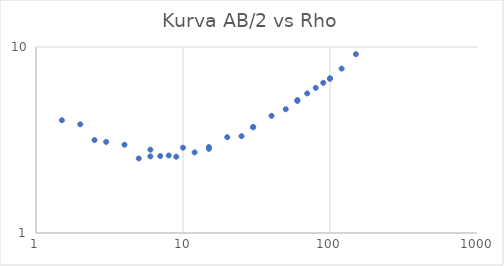
| Category | Series 0 |
|---|---|
| 1.5 | 4.038 |
| 2.0 | 3.84 |
| 2.5 | 3.159 |
| 3.0 | 3.088 |
| 4.0 | 2.982 |
| 5.0 | 2.517 |
| 6.0 | 2.806 |
| 6.0 | 2.582 |
| 7.0 | 2.593 |
| 8.0 | 2.611 |
| 9.0 | 2.571 |
| 10.0 | 2.875 |
| 12.0 | 2.712 |
| 15.0 | 2.835 |
| 15.0 | 2.897 |
| 20.0 | 3.274 |
| 25.0 | 3.315 |
| 30.0 | 3.718 |
| 30.0 | 3.701 |
| 40.0 | 4.266 |
| 50.0 | 4.628 |
| 60.0 | 5.185 |
| 60.0 | 5.127 |
| 70.0 | 5.629 |
| 80.0 | 6.03 |
| 90.0 | 6.419 |
| 100.0 | 6.743 |
| 100.0 | 6.793 |
| 120.0 | 7.651 |
| 150.0 | 9.148 |